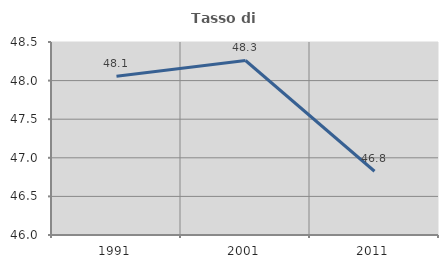
| Category | Tasso di occupazione   |
|---|---|
| 1991.0 | 48.055 |
| 2001.0 | 48.26 |
| 2011.0 | 46.826 |